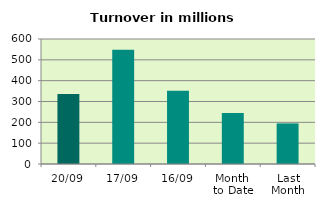
| Category | Series 0 |
|---|---|
| 20/09 | 335.943 |
| 17/09 | 547.871 |
| 16/09 | 351.902 |
| Month 
to Date | 244.327 |
| Last
Month | 194.848 |